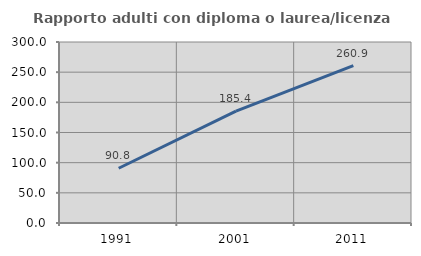
| Category | Rapporto adulti con diploma o laurea/licenza media  |
|---|---|
| 1991.0 | 90.756 |
| 2001.0 | 185.393 |
| 2011.0 | 260.87 |